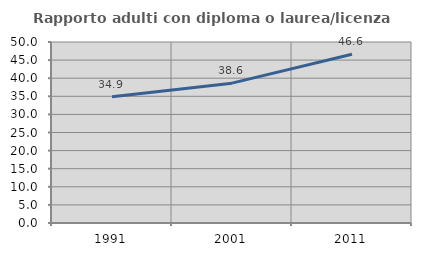
| Category | Rapporto adulti con diploma o laurea/licenza media  |
|---|---|
| 1991.0 | 34.884 |
| 2001.0 | 38.636 |
| 2011.0 | 46.602 |